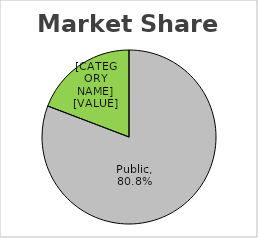
| Category | Series 0 |
|---|---|
| Public | 0.808 |
| Non Public | 0.192 |